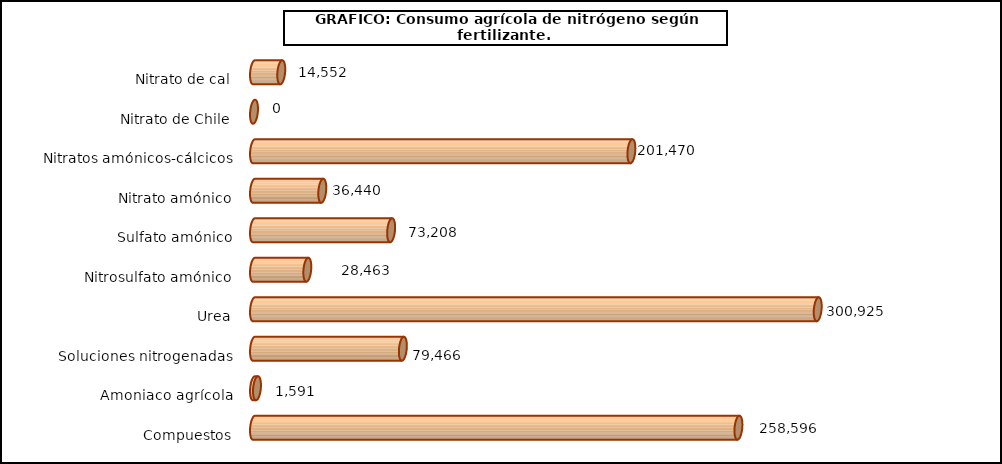
| Category | fert. N |
|---|---|
| 0 | 14552 |
| 1 | 0 |
| 2 | 201470 |
| 3 | 36440 |
| 4 | 73208 |
| 5 | 28463 |
| 6 | 300925 |
| 7 | 79466 |
| 8 | 1591 |
| 9 | 258596 |